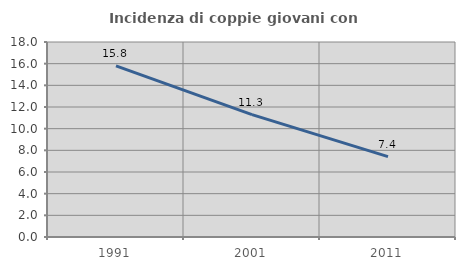
| Category | Incidenza di coppie giovani con figli |
|---|---|
| 1991.0 | 15.793 |
| 2001.0 | 11.293 |
| 2011.0 | 7.423 |